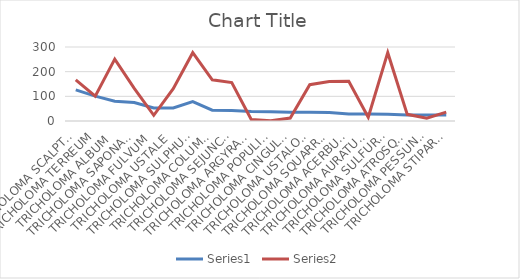
| Category | Series 0 | Series 1 |
|---|---|---|
| TRICHOLOMA SCALPTURATUM | 126 | 167 |
| TRICHOLOMA TERREUM | 101 | 101 |
| TRICHOLOMA ALBUM | 80 | 251 |
| TRICHOLOMA SAPONACEUM | 75 | 132 |
| TRICHOLOMA FULVUM | 53 | 23 |
| TRICHOLOMA USTALE | 53 | 131 |
| TRICHOLOMA SULPHUREUM | 79 | 277 |
| TRICHOLOMA COLUMBETTA | 44 | 167 |
| TRICHOLOMA SEJUNCTUM | 43 | 156 |
| TRICHOLOMA ARGYRACEUM | 39 | 6 |
| TRICHOLOMA POPULINUM | 38 | 1 |
| TRICHOLOMA CINGULATUM | 35 | 12 |
| TRICHOLOMA USTALOIDES | 35 | 147 |
| TRICHOLOMA SQUARRULOSUM | 34 | 160 |
| TRICHOLOMA ACERBUM | 28 | 161 |
| TRICHOLOMA AURATUM | 28 | 15 |
| TRICHOLOMA SULFUREUM | 27 | 277 |
| TRICHOLOMA ATROSQUAMOSUM | 24 | 27 |
| TRICHOLOMA PESSUNDATUM | 24 | 11 |
| TRICHOLOMA STIPAROPHYLLUM | 24 | 36 |